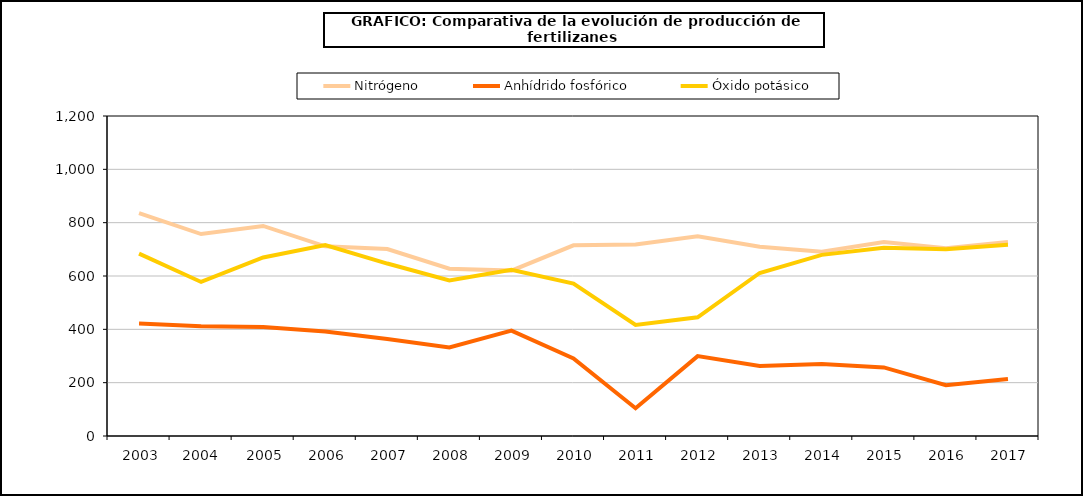
| Category | Nitrógeno | Anhídrido fosfórico | Óxido potásico |
|---|---|---|---|
|   2003 | 835.9 |  |  |
|   2004  | 757.2 |  |  |
|   2005 | 787.7 |  |  |
|   2006 | 711.4 |  |  |
|   2007 | 701.022 |  |  |
|   2008 | 627.3 |  |  |
|   2009 | 620.2 |  |  |
|   2010 | 715 |  |  |
|   2011 | 718.1 |  |  |
|   2012 | 748.9 |  |  |
|   2013 | 710 |  |  |
|   2014 | 691.1 |  |  |
|   2015 | 727.2 |  |  |
|   2016 | 703.8 |  |  |
|   2017 | 728 |  |  |